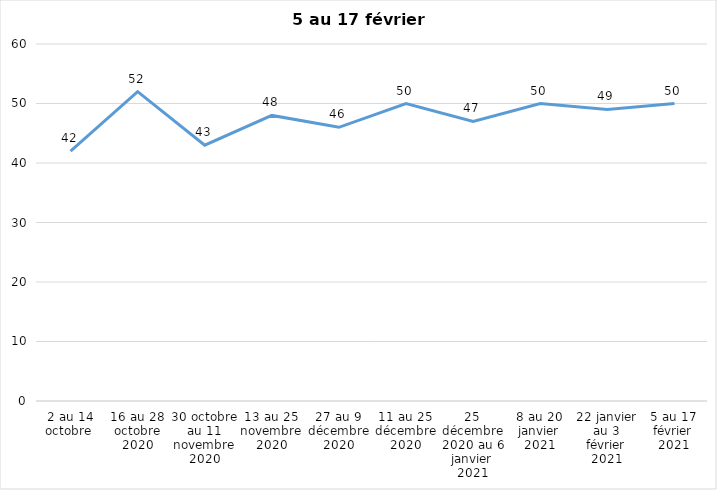
| Category | Toujours aux trois mesures |
|---|---|
| 2 au 14 octobre  | 42 |
| 16 au 28 octobre 2020 | 52 |
| 30 octobre au 11 novembre 2020 | 43 |
| 13 au 25 novembre 2020 | 48 |
| 27 au 9 décembre 2020 | 46 |
| 11 au 25 décembre 2020 | 50 |
| 25 décembre 2020 au 6 janvier 2021 | 47 |
| 8 au 20 janvier 2021 | 50 |
| 22 janvier au 3 février 2021 | 49 |
| 5 au 17 février 2021 | 50 |